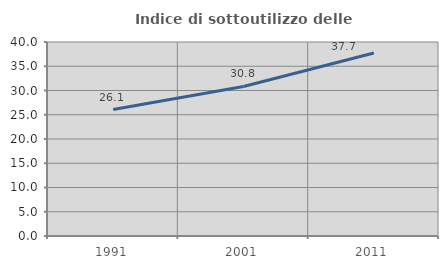
| Category | Indice di sottoutilizzo delle abitazioni  |
|---|---|
| 1991.0 | 26.078 |
| 2001.0 | 30.839 |
| 2011.0 | 37.716 |